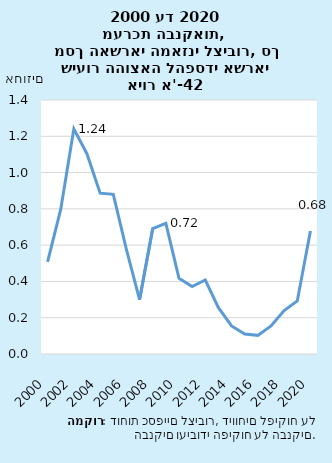
| Category | סך מערכת |
|---|---|
| 2000-12-31 | 0.508 |
| 2001-12-31 | 0.797 |
| 2002-12-31 | 1.241 |
| 2003-12-31 | 1.103 |
| 2004-12-31 | 0.886 |
| 2005-12-31 | 0.88 |
| 2006-12-31 | 0.576 |
| 2007-12-31 | 0.299 |
| 2008-12-31 | 0.691 |
| 2009-12-31 | 0.72 |
| 2010-12-31 | 0.417 |
| 2011-12-31 | 0.372 |
| 2012-12-31 | 0.408 |
| 2013-12-31 | 0.255 |
| 2014-12-31 | 0.155 |
| 2015-12-31 | 0.11 |
| 2016-12-31 | 0.103 |
| 2017-12-31 | 0.155 |
| 2018-12-31 | 0.239 |
| 2019-12-31 | 0.292 |
| 2020-12-31 | 0.678 |